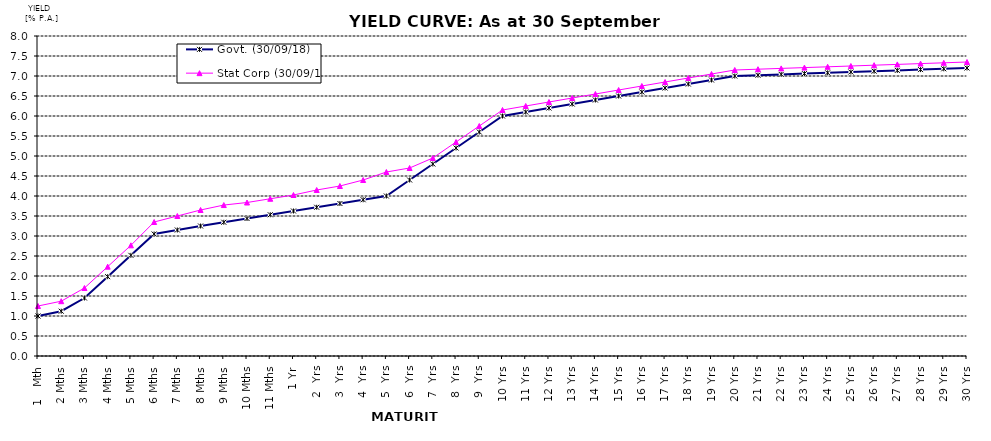
| Category | Govt. (30/09/18) | Stat Corp (30/09/18) |
|---|---|---|
| 1   Mth | 1 | 1.25 |
| 2 Mths | 1.12 | 1.37 |
| 3 Mths | 1.45 | 1.7 |
| 4 Mths | 1.983 | 2.233 |
| 5 Mths | 2.517 | 2.767 |
| 6 Mths | 3.05 | 3.35 |
| 7 Mths | 3.15 | 3.5 |
| 8 Mths | 3.25 | 3.65 |
| 9 Mths | 3.344 | 3.774 |
| 10 Mths | 3.438 | 3.838 |
| 11 Mths | 3.531 | 3.931 |
| 1 Yr | 3.625 | 4.025 |
| 2  Yrs | 3.719 | 4.15 |
| 3  Yrs | 3.812 | 4.25 |
| 4  Yrs | 3.906 | 4.4 |
| 5  Yrs | 4 | 4.6 |
| 6  Yrs | 4.4 | 4.7 |
| 7  Yrs | 4.8 | 4.95 |
| 8  Yrs | 5.2 | 5.35 |
| 9  Yrs | 5.6 | 5.75 |
| 10 Yrs | 6 | 6.15 |
| 11 Yrs | 6.1 | 6.25 |
| 12 Yrs | 6.2 | 6.35 |
| 13 Yrs | 6.3 | 6.45 |
| 14 Yrs | 6.4 | 6.55 |
| 15 Yrs | 6.5 | 6.65 |
| 16 Yrs | 6.6 | 6.75 |
| 17 Yrs | 6.7 | 6.85 |
| 18 Yrs | 6.8 | 6.95 |
| 19 Yrs | 6.9 | 7.05 |
| 20 Yrs | 7 | 7.15 |
| 21 Yrs | 7.02 | 7.17 |
| 22 Yrs | 7.04 | 7.19 |
| 23 Yrs | 7.06 | 7.21 |
| 24 Yrs | 7.08 | 7.23 |
| 25 Yrs | 7.1 | 7.25 |
| 26 Yrs | 7.12 | 7.27 |
| 27 Yrs | 7.14 | 7.29 |
| 28 Yrs | 7.16 | 7.31 |
| 29 Yrs | 7.18 | 7.33 |
| 30 Yrs | 7.2 | 7.35 |